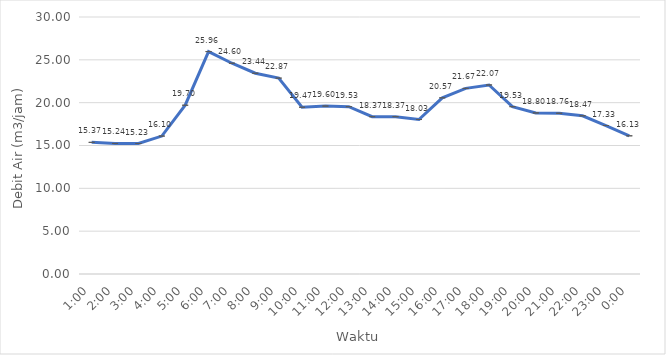
| Category | Q aktual (m3) |
|---|---|
| 0.041666666666666664 | 15.368 |
| 0.08333333333333333 | 15.236 |
| 0.125 | 15.232 |
| 0.166666666666667 | 16.1 |
| 0.208333333333333 | 19.702 |
| 0.25 | 25.962 |
| 0.291666666666667 | 24.602 |
| 0.333333333333333 | 23.435 |
| 0.375 | 22.866 |
| 0.416666666666666 | 19.466 |
| 0.458333333333333 | 19.602 |
| 0.5 | 19.534 |
| 0.541666666666666 | 18.367 |
| 0.583333333333333 | 18.367 |
| 0.625 | 18.033 |
| 0.666666666666666 | 20.567 |
| 0.708333333333333 | 21.668 |
| 0.75 | 22.065 |
| 0.791666666666666 | 19.533 |
| 0.833333333333333 | 18.803 |
| 0.875 | 18.763 |
| 0.916666666666666 | 18.468 |
| 0.958333333333333 | 17.333 |
| 1900-01-01 | 16.13 |